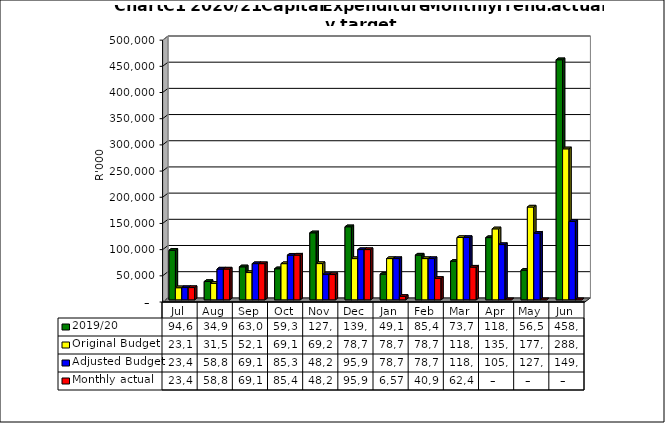
| Category | 2019/20 | Original Budget | Adjusted Budget | Monthly actual |
|---|---|---|---|---|
| Jul | 94661917.305 | 23146604.34 | 23449713.353 | 23449713.35 |
| Aug | 34997120.505 | 31506119.635 | 58840827.869 | 58840827.87 |
| Sep | 63024484.609 | 52101276.725 | 69126894.335 | 69126894.33 |
| Oct | 59349467.812 | 69111701.558 | 85314622.258 | 85425681.67 |
| Nov | 127966561.363 | 69234670.496 | 48292769.82 | 48292769.81 |
| Dec | 139558296.79 | 78739947.961 | 95953914.122 | 95953914.3 |
| Jan | 49120173.272 | 78780743.315 | 78780754.377 | 6570769.858 |
| Feb | 85478228.192 | 78780743.315 | 78780743.315 | 40968693.029 |
| Mar | 73737271.004 | 118994885.383 | 118994902.982 | 62477125.802 |
| Apr | 118845502.652 | 135539662.905 | 105539683.133 | 0 |
| May | 56523169.68 | 177230590.985 | 127230617.567 | 0 |
| Jun | 458444574.171 | 288331735.384 | 149575587.23 | 0 |